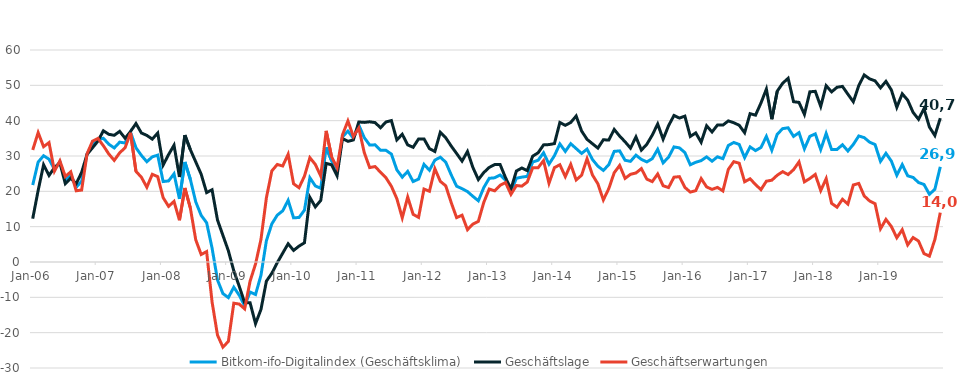
| Category | Bitkom-ifo-Digitalindex (Geschäftsklima) | Geschäftslage | Geschäftserwartungen |
|---|---|---|---|
| 2006-01-01 | 21.775 | 12.268 | 31.709 |
| 2006-02-01 | 28.288 | 20.25 | 36.62 |
| 2006-03-01 | 30.068 | 27.529 | 32.636 |
| 2006-04-01 | 29.095 | 24.489 | 33.796 |
| 2006-05-01 | 26.21 | 26.71 | 25.71 |
| 2006-06-01 | 28.35 | 28.08 | 28.63 |
| 2006-07-01 | 23.18 | 22.16 | 24.19 |
| 2006-08-01 | 24.64 | 23.75 | 25.53 |
| 2006-09-01 | 21.15 | 22.15 | 20.16 |
| 2006-10-01 | 22.85 | 25.37 | 20.36 |
| 2006-11-01 | 30.55 | 30.46 | 30.63 |
| 2006-12-01 | 33.25 | 32.32 | 34.18 |
| 2007-01-01 | 34.6 | 34.22 | 34.98 |
| 2007-02-01 | 35.02 | 37.14 | 32.91 |
| 2007-03-01 | 33.34 | 36.14 | 30.57 |
| 2007-04-01 | 32.28 | 35.86 | 28.76 |
| 2007-05-01 | 33.92 | 36.97 | 30.9 |
| 2007-06-01 | 33.68 | 35.02 | 32.34 |
| 2007-07-01 | 36.75 | 36.94 | 36.56 |
| 2007-08-01 | 32.33 | 39.19 | 25.66 |
| 2007-09-01 | 30.16 | 36.51 | 23.98 |
| 2007-10-01 | 28.38 | 35.83 | 21.16 |
| 2007-11-01 | 29.75 | 34.78 | 24.82 |
| 2007-12-01 | 30.25 | 36.5 | 24.16 |
| 2008-01-01 | 22.77 | 27.44 | 18.21 |
| 2008-02-01 | 22.95 | 30.4 | 15.75 |
| 2008-03-01 | 24.96 | 33.05 | 17.15 |
| 2008-04-01 | 17.86 | 24.07 | 11.82 |
| 2008-05-01 | 28.31 | 35.91 | 20.95 |
| 2008-06-01 | 23.42 | 31.82 | 15.32 |
| 2008-07-01 | 17.02 | 28.33 | 6.27 |
| 2008-08-01 | 13.18 | 24.84 | 2.12 |
| 2008-09-01 | 11.12 | 19.64 | 2.94 |
| 2008-10-01 | 3.97 | 20.44 | -11.27 |
| 2008-11-01 | -5.08 | 11.89 | -20.69 |
| 2008-12-01 | -8.94 | 7.53 | -24.1 |
| 2009-01-01 | -10.08 | 3.18 | -22.47 |
| 2009-02-01 | -7.14 | -2.51 | -11.66 |
| 2009-03-01 | -9.4 | -6.86 | -11.91 |
| 2009-04-01 | -12.41 | -11.55 | -13.27 |
| 2009-05-01 | -8.5 | -11.55 | -5.41 |
| 2009-06-01 | -9.2 | -17.45 | -0.58 |
| 2009-07-01 | -3.77 | -13.43 | 6.4 |
| 2009-08-01 | 6.04 | -5.42 | 18.17 |
| 2009-09-01 | 10.79 | -3.19 | 25.78 |
| 2009-10-01 | 13.26 | -0.19 | 27.61 |
| 2009-11-01 | 14.48 | 2.5 | 27.17 |
| 2009-12-01 | 17.46 | 5.16 | 30.5 |
| 2010-01-01 | 12.5 | 3.28 | 22.14 |
| 2010-02-01 | 12.6 | 4.49 | 21.03 |
| 2010-03-01 | 14.66 | 5.44 | 24.29 |
| 2010-04-01 | 23.84 | 18.3 | 29.52 |
| 2010-05-01 | 21.53 | 15.6 | 27.62 |
| 2010-06-01 | 20.86 | 17.43 | 24.33 |
| 2010-07-01 | 32.46 | 27.9 | 37.11 |
| 2010-08-01 | 28.64 | 27.51 | 29.77 |
| 2010-09-01 | 25.56 | 24.42 | 26.7 |
| 2010-10-01 | 35.47 | 34.95 | 35.99 |
| 2010-11-01 | 37.02 | 34.15 | 39.92 |
| 2010-12-01 | 35.03 | 34.54 | 35.52 |
| 2011-01-01 | 38.77 | 39.63 | 37.92 |
| 2011-02-01 | 35.22 | 39.51 | 31.01 |
| 2011-03-01 | 33.11 | 39.68 | 26.72 |
| 2011-04-01 | 33.16 | 39.46 | 27.02 |
| 2011-05-01 | 31.61 | 37.99 | 25.39 |
| 2011-06-01 | 31.6 | 39.64 | 23.83 |
| 2011-07-01 | 30.54 | 40.02 | 21.43 |
| 2011-08-01 | 26.09 | 34.56 | 17.93 |
| 2011-09-01 | 24.01 | 36.14 | 12.5 |
| 2011-10-01 | 25.64 | 33.14 | 18.39 |
| 2011-11-01 | 22.77 | 32.46 | 13.49 |
| 2011-12-01 | 23.46 | 34.83 | 12.63 |
| 2012-01-01 | 27.63 | 34.84 | 20.64 |
| 2012-02-01 | 25.97 | 32.09 | 20.02 |
| 2012-03-01 | 28.83 | 31.28 | 26.4 |
| 2012-04-01 | 29.66 | 36.71 | 22.83 |
| 2012-05-01 | 28.25 | 35.15 | 21.56 |
| 2012-06-01 | 24.69 | 32.83 | 16.83 |
| 2012-07-01 | 21.45 | 30.71 | 12.56 |
| 2012-08-01 | 20.76 | 28.56 | 13.24 |
| 2012-09-01 | 19.93 | 31.27 | 9.15 |
| 2012-10-01 | 18.58 | 26.74 | 10.72 |
| 2012-11-01 | 17.33 | 23.33 | 11.5 |
| 2012-12-01 | 21.06 | 25.32 | 16.87 |
| 2013-01-01 | 23.69 | 26.77 | 20.65 |
| 2013-02-01 | 23.83 | 27.57 | 20.15 |
| 2013-03-01 | 24.63 | 27.6 | 21.7 |
| 2013-04-01 | 23.18 | 23.86 | 22.5 |
| 2013-05-01 | 19.9 | 20.65 | 19.15 |
| 2013-06-01 | 23.7 | 25.76 | 21.65 |
| 2013-07-01 | 24.02 | 26.6 | 21.47 |
| 2013-08-01 | 24.24 | 25.86 | 22.63 |
| 2013-09-01 | 28.3 | 29.95 | 26.67 |
| 2013-10-01 | 28.79 | 30.91 | 26.68 |
| 2013-11-01 | 30.91 | 33.15 | 28.69 |
| 2013-12-01 | 27.69 | 33.23 | 22.28 |
| 2014-01-01 | 30.09 | 33.51 | 26.71 |
| 2014-02-01 | 33.42 | 39.48 | 27.52 |
| 2014-03-01 | 31.3 | 38.68 | 24.16 |
| 2014-04-01 | 33.48 | 39.49 | 27.63 |
| 2014-05-01 | 32.1 | 41.32 | 23.23 |
| 2014-06-01 | 30.73 | 37.07 | 24.56 |
| 2014-07-01 | 31.95 | 34.72 | 29.21 |
| 2014-08-01 | 29 | 33.47 | 24.63 |
| 2014-09-01 | 27.12 | 32.24 | 22.11 |
| 2014-10-01 | 25.92 | 34.6 | 17.56 |
| 2014-11-01 | 27.53 | 34.51 | 20.76 |
| 2014-12-01 | 31.31 | 37.52 | 25.27 |
| 2015-01-01 | 31.45 | 35.64 | 27.33 |
| 2015-02-01 | 28.79 | 34.02 | 23.67 |
| 2015-03-01 | 28.49 | 32.22 | 24.82 |
| 2015-04-01 | 30.24 | 35.4 | 25.2 |
| 2015-05-01 | 29.03 | 31.66 | 26.43 |
| 2015-06-01 | 28.33 | 33.31 | 23.46 |
| 2015-07-01 | 29.24 | 35.91 | 22.75 |
| 2015-08-01 | 31.88 | 39.06 | 24.91 |
| 2015-09-01 | 28.07 | 34.75 | 21.58 |
| 2015-10-01 | 29.65 | 38.57 | 21.07 |
| 2015-11-01 | 32.57 | 41.47 | 24 |
| 2015-12-01 | 32.3 | 40.73 | 24.16 |
| 2016-01-01 | 30.98 | 41.28 | 21.12 |
| 2016-02-01 | 27.52 | 35.54 | 19.78 |
| 2016-03-01 | 28.22 | 36.54 | 20.19 |
| 2016-04-01 | 28.69 | 33.89 | 23.61 |
| 2016-05-01 | 29.75 | 38.56 | 21.25 |
| 2016-06-01 | 28.53 | 36.8 | 20.55 |
| 2016-07-01 | 29.77 | 38.77 | 21.11 |
| 2016-08-01 | 29.24 | 38.75 | 20.11 |
| 2016-09-01 | 32.97 | 39.93 | 26.22 |
| 2016-10-01 | 33.83 | 39.41 | 28.39 |
| 2016-11-01 | 33.27 | 38.7 | 27.96 |
| 2016-12-01 | 29.54 | 36.59 | 22.71 |
| 2017-01-01 | 32.58 | 41.98 | 23.55 |
| 2017-02-01 | 31.53 | 41.56 | 21.92 |
| 2017-03-01 | 32.41 | 44.99 | 20.47 |
| 2017-04-01 | 35.54 | 48.93 | 22.87 |
| 2017-05-01 | 31.62 | 40.4 | 23.15 |
| 2017-06-01 | 36.16 | 48.35 | 24.56 |
| 2017-07-01 | 37.75 | 50.59 | 25.57 |
| 2017-08-01 | 37.98 | 51.99 | 24.74 |
| 2017-09-01 | 35.55 | 45.37 | 26.13 |
| 2017-10-01 | 36.6 | 45.17 | 28.32 |
| 2017-11-01 | 32.04 | 41.78 | 22.69 |
| 2017-12-01 | 35.57 | 48.16 | 23.63 |
| 2018-01-01 | 36.26 | 48.3 | 24.79 |
| 2018-02-01 | 31.82 | 44.04 | 20.21 |
| 2018-03-01 | 36.38 | 49.9 | 23.59 |
| 2018-04-01 | 31.84 | 48.15 | 16.6 |
| 2018-05-01 | 31.86 | 49.45 | 15.51 |
| 2018-06-01 | 33.18 | 49.7 | 17.75 |
| 2018-07-01 | 31.42 | 47.49 | 16.39 |
| 2018-08-01 | 33.28 | 45.35 | 21.8 |
| 2018-09-01 | 35.67 | 49.92 | 22.24 |
| 2018-10-01 | 35.2 | 52.94 | 18.7 |
| 2018-11-01 | 33.91 | 51.83 | 17.27 |
| 2018-12-01 | 33.24 | 51.27 | 16.5 |
| 2019-01-01 | 28.482 | 49.283 | 9.417 |
| 2019-02-01 | 30.764 | 51.126 | 12.053 |
| 2019-03-01 | 28.551 | 48.691 | 10.041 |
| 2019-04-01 | 24.56 | 43.779 | 6.857 |
| 2019-05-01 | 27.558 | 47.609 | 9.131 |
| 2019-06-01 | 24.39 | 45.806 | 4.839 |
| 2019-07-01 | 23.932 | 42.337 | 6.925 |
| 2019-08-01 | 22.489 | 40.388 | 5.922 |
| 2019-09-01 | 21.951 | 43.405 | 2.388 |
| 2019-10-01 | 19.171 | 38.195 | 1.667 |
| 2019-11-01 | 20.57 | 35.804 | 6.32 |
| 2019-12-01 | 26.943 | 40.706 | 13.968 |